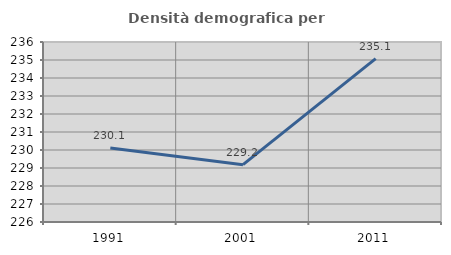
| Category | Densità demografica |
|---|---|
| 1991.0 | 230.11 |
| 2001.0 | 229.185 |
| 2011.0 | 235.079 |